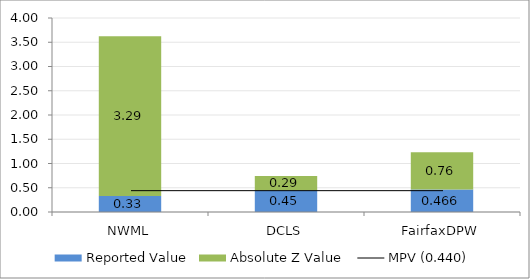
| Category | Reported Value | Absolute Z Value  |
|---|---|---|
| NWML | 0.328 | 3.294 |
| DCLS | 0.45 | 0.294 |
| FairfaxDPW | 0.466 | 0.765 |